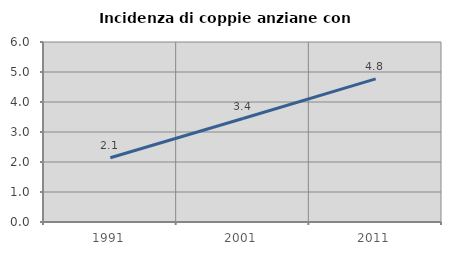
| Category | Incidenza di coppie anziane con figli |
|---|---|
| 1991.0 | 2.141 |
| 2001.0 | 3.448 |
| 2011.0 | 4.769 |